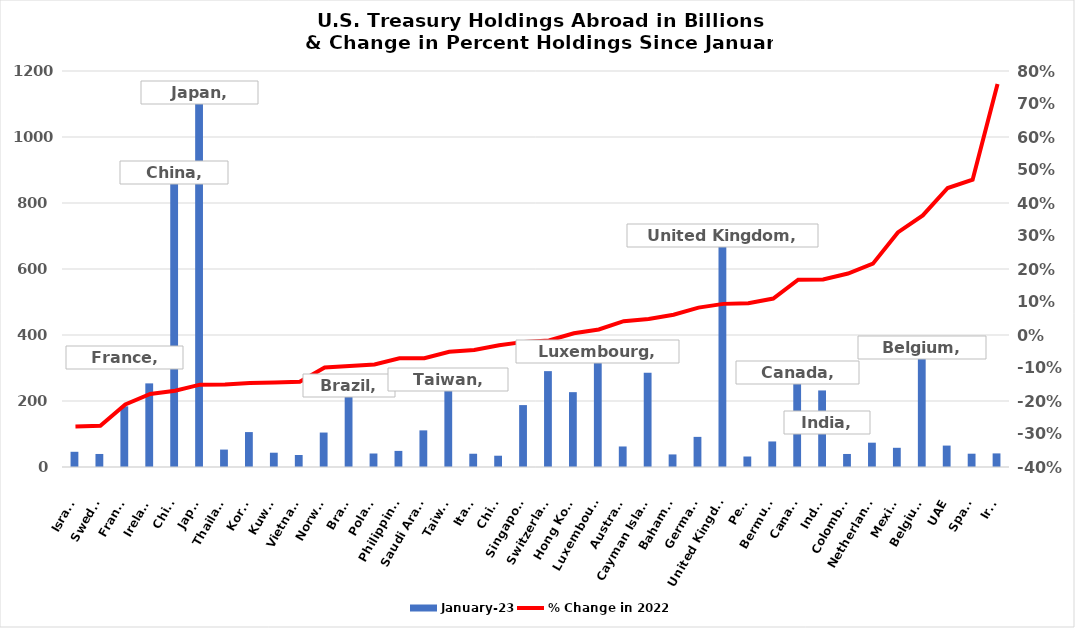
| Category | January-23 | December-22 | November-22 | October-22 | September-22 | August-22 | July-22 | June-22 | May-22 | April-22 | March-22 | February-22 |
|---|---|---|---|---|---|---|---|---|---|---|---|---|
| Israel | 46.1 |  |  |  |  |  |  |  |  |  |  |  |
| Sweden | 39.5 |  |  |  |  |  |  |  |  |  |  |  |
| France | 183.9 |  |  |  |  |  |  |  |  |  |  |  |
| Ireland | 253.4 |  |  |  |  |  |  |  |  |  |  |  |
| China | 859.4 |  |  |  |  |  |  |  |  |  |  |  |
| Japan | 1104.4 |  |  |  |  |  |  |  |  |  |  |  |
| Thailand | 52.8 |  |  |  |  |  |  |  |  |  |  |  |
| Korea | 105.8 |  |  |  |  |  |  |  |  |  |  |  |
| Kuwait | 43.3 |  |  |  |  |  |  |  |  |  |  |  |
| Vietnam | 36.3 |  |  |  |  |  |  |  |  |  |  |  |
| Norway | 104.4 |  |  |  |  |  |  |  |  |  |  |  |
| Brazil | 214 |  |  |  |  |  |  |  |  |  |  |  |
| Poland | 40.9 |  |  |  |  |  |  |  |  |  |  |  |
| Philippines | 48.8 |  |  |  |  |  |  |  |  |  |  |  |
| Saudi Arabia | 111 |  |  |  |  |  |  |  |  |  |  |  |
| Taiwan | 234.6 |  |  |  |  |  |  |  |  |  |  |  |
| Italy | 40.2 |  |  |  |  |  |  |  |  |  |  |  |
| Chile | 34.2 |  |  |  |  |  |  |  |  |  |  |  |
| Singapore | 187.6 |  |  |  |  |  |  |  |  |  |  |  |
| Switzerland | 290.5 |  |  |  |  |  |  |  |  |  |  |  |
| Hong Kong | 226.8 |  |  |  |  |  |  |  |  |  |  |  |
| Luxembourg | 318.2 |  |  |  |  |  |  |  |  |  |  |  |
| Australia | 62.2 |  |  |  |  |  |  |  |  |  |  |  |
| Cayman Islands | 285.3 |  |  |  |  |  |  |  |  |  |  |  |
| Bahamas | 38.1 |  |  |  |  |  |  |  |  |  |  |  |
| Germany | 91.3 |  |  |  |  |  |  |  |  |  |  |  |
| United Kingdom | 668.3 |  |  |  |  |  |  |  |  |  |  |  |
| Peru | 31.8 |  |  |  |  |  |  |  |  |  |  |  |
| Bermuda | 77.4 |  |  |  |  |  |  |  |  |  |  |  |
| Canada | 254.1 |  |  |  |  |  |  |  |  |  |  |  |
| India | 232 |  |  |  |  |  |  |  |  |  |  |  |
| Colombia | 39.5 |  |  |  |  |  |  |  |  |  |  |  |
| Netherlands | 73.7 |  |  |  |  |  |  |  |  |  |  |  |
| Mexico | 58.2 |  |  |  |  |  |  |  |  |  |  |  |
| Belgium | 331.1 |  |  |  |  |  |  |  |  |  |  |  |
| UAE | 64.9 |  |  |  |  |  |  |  |  |  |  |  |
| Spain | 40.3 |  |  |  |  |  |  |  |  |  |  |  |
| Iraq | 41.2 |  |  |  |  |  |  |  |  |  |  |  |